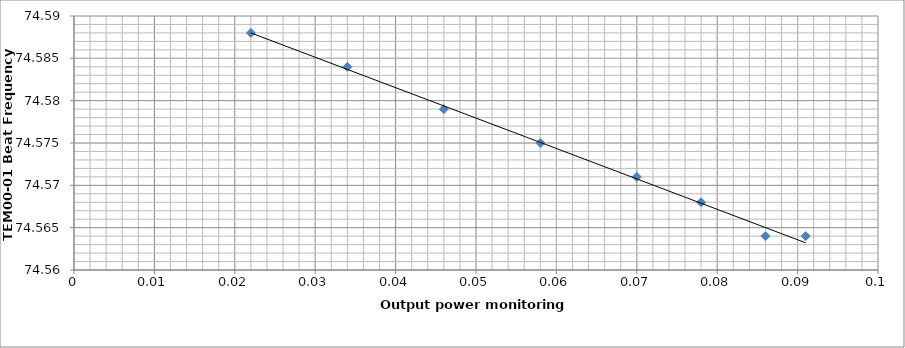
| Category | Series 0 |
|---|---|
| 0.091 | 74.564 |
| 0.086 | 74.564 |
| 0.078 | 74.568 |
| 0.07 | 74.571 |
| 0.058 | 74.575 |
| 0.046 | 74.579 |
| 0.034 | 74.584 |
| 0.022 | 74.588 |